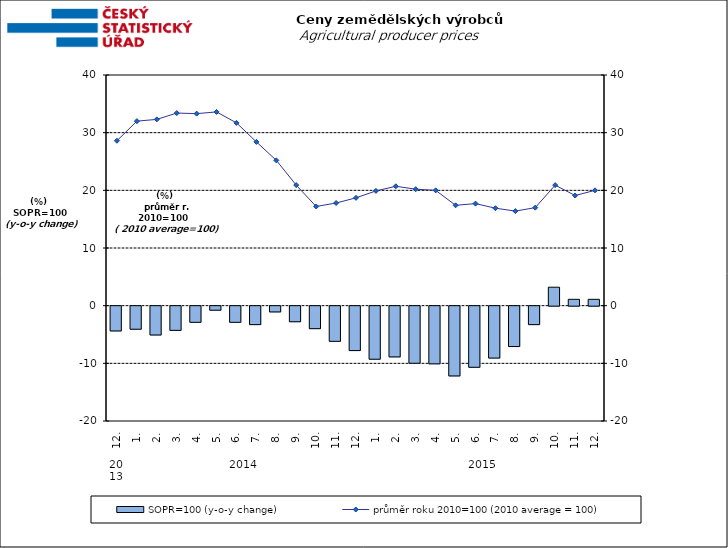
| Category | SOPR=100 (y-o-y change)   |
|---|---|
| 0 | -4.3 |
| 1 | -4 |
| 2 | -5 |
| 3 | -4.2 |
| 4 | -2.8 |
| 5 | -0.7 |
| 6 | -2.8 |
| 7 | -3.2 |
| 8 | -1 |
| 9 | -2.7 |
| 10 | -3.9 |
| 11 | -6.1 |
| 12 | -7.7 |
| 13 | -9.2 |
| 14 | -8.8 |
| 15 | -9.9 |
| 16 | -10 |
| 17 | -12.1 |
| 18 | -10.6 |
| 19 | -9 |
| 20 | -7 |
| 21 | -3.2 |
| 22 | 3.2 |
| 23 | 1.1 |
| 24 | 1.1 |